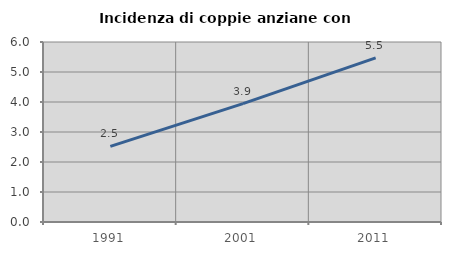
| Category | Incidenza di coppie anziane con figli |
|---|---|
| 1991.0 | 2.521 |
| 2001.0 | 3.947 |
| 2011.0 | 5.473 |